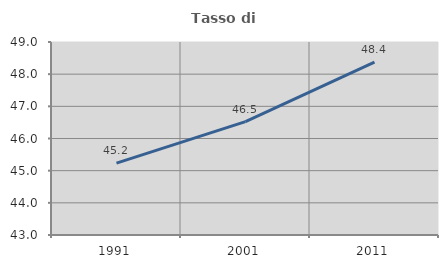
| Category | Tasso di occupazione   |
|---|---|
| 1991.0 | 45.233 |
| 2001.0 | 46.524 |
| 2011.0 | 48.376 |